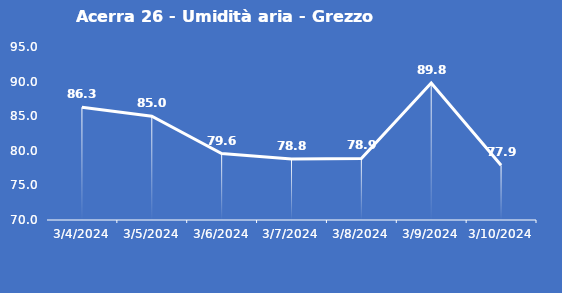
| Category | Acerra 26 - Umidità aria - Grezzo (%) |
|---|---|
| 3/4/24 | 86.3 |
| 3/5/24 | 85 |
| 3/6/24 | 79.6 |
| 3/7/24 | 78.8 |
| 3/8/24 | 78.9 |
| 3/9/24 | 89.8 |
| 3/10/24 | 77.9 |